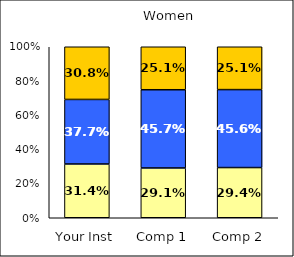
| Category | Low Social Self-Concept | Average Social Self-Concept | High Social Self-Concept |
|---|---|---|---|
| Your Inst | 0.314 | 0.377 | 0.308 |
| Comp 1 | 0.291 | 0.457 | 0.251 |
| Comp 2 | 0.294 | 0.456 | 0.251 |